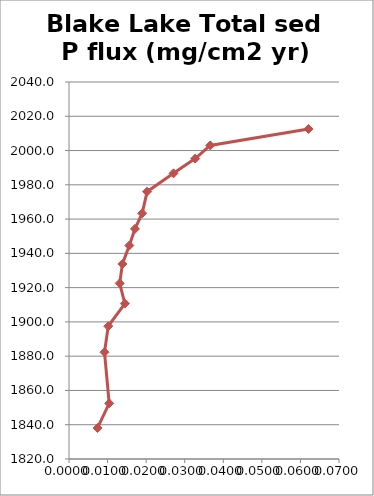
| Category | Total sed P flux (mg/cm2 yr) |
|---|---|
| 0.062084540621369144 | 2012.6 |
| 0.03661471142880979 | 2003 |
| 0.03270988573866719 | 1995.3 |
| 0.027098221342573794 | 1986.7 |
| 0.020242098502868493 | 1976 |
| 0.01897740115500845 | 1963.4 |
| 0.017095671424475694 | 1954.3 |
| 0.015642955983149322 | 1944.6 |
| 0.013842293375639012 | 1933.8 |
| 0.013144189122862271 | 1922.5 |
| 0.014481188362906334 | 1910.7 |
| 0.010178078596081934 | 1897.5 |
| 0.009201723388767553 | 1882.3 |
| 0.010417752948790243 | 1852.5 |
| 0.00740679067475406 | 1838.1 |